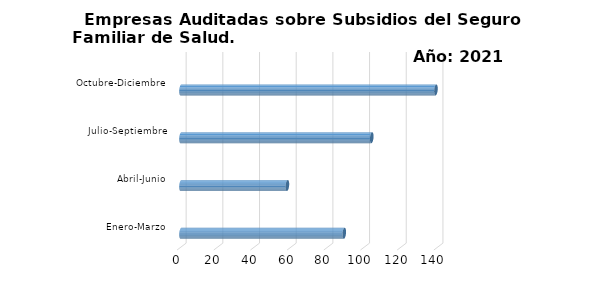
| Category | Empresas Auditadas/1 | Series 1 | Series 2 |
|---|---|---|---|
| Enero-Marzo | 89 |  |  |
| Abril-Junio | 58 |  |  |
| Julio-Septiembre | 104 |  |  |
| Octubre-Diciembre | 139 |  |  |